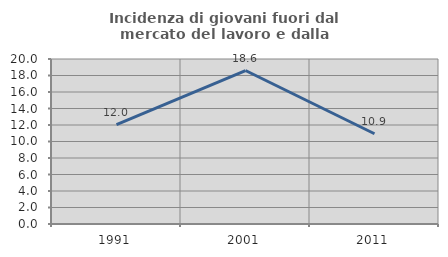
| Category | Incidenza di giovani fuori dal mercato del lavoro e dalla formazione  |
|---|---|
| 1991.0 | 12.037 |
| 2001.0 | 18.605 |
| 2011.0 | 10.938 |